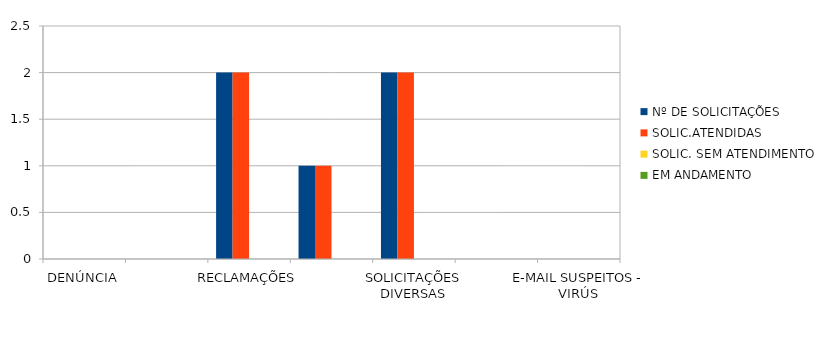
| Category | Nº DE SOLICITAÇÕES | SOLIC.ATENDIDAS | SOLIC. SEM ATENDIMENTO | EM ANDAMENTO |
|---|---|---|---|---|
| DENÚNCIA | 0 | 0 | 0 | 0 |
| DÚVIDA | 0 | 0 | 0 | 0 |
| RECLAMAÇÕES | 2 | 2 | 0 | 0 |
| PEDIDO DE ACESSO À INFORMAÇÃO | 1 | 1 | 0 | 0 |
| SOLICITAÇÕES DIVERSAS | 2 | 2 | 0 | 0 |
| SUGESTÃO  | 0 | 0 | 0 | 0 |
| E-MAIL SUSPEITOS - VIRÚS | 0 | 0 | 0 | 0 |